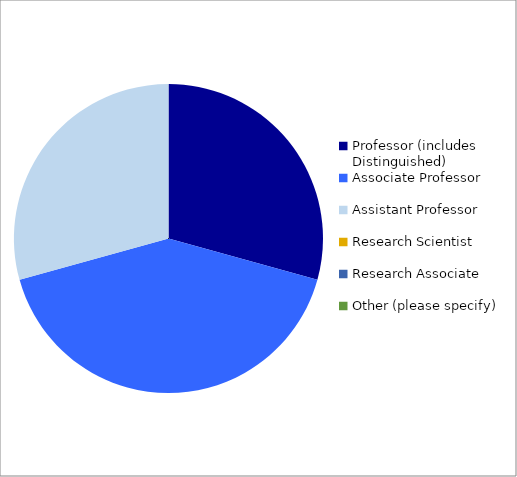
| Category | Series 0 |
|---|---|
| Professor (includes Distinguished) | 0.29 |
| Associate Professor | 0.41 |
| Assistant Professor | 0.29 |
| Research Scientist | 0 |
| Research Associate | 0 |
| Other (please specify) | 0 |